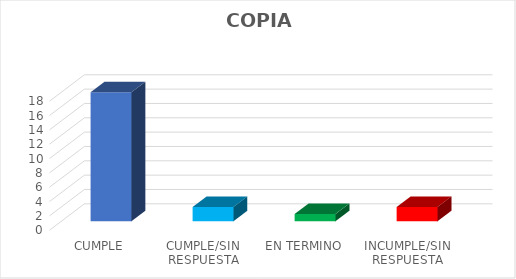
| Category | TOTAL |
|---|---|
| CUMPLE | 18 |
| CUMPLE/SIN RESPUESTA | 2 |
| EN TERMINO | 1 |
| INCUMPLE/SIN RESPUESTA | 2 |